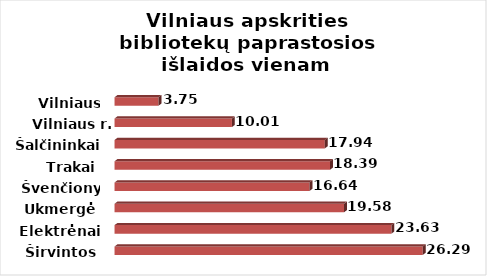
| Category | Series 0 |
|---|---|
| Širvintos | 26.294 |
| Elektrėnai | 23.626 |
| Ukmergė | 19.577 |
| Švenčionys | 16.635 |
| Trakai | 18.389 |
| Šalčininkai | 17.939 |
| Vilniaus r. | 10.015 |
| Vilniaus m. | 3.748 |